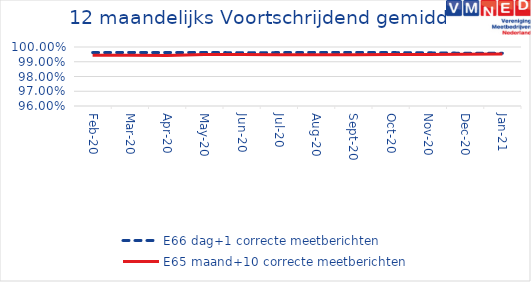
| Category | E66 dag+1 correcte meetberichten | E65 maand+10 correcte meetberichten |
|---|---|---|
| 2020-02-01 | 0.996 | 0.994 |
| 2020-03-01 | 0.996 | 0.994 |
| 2020-04-01 | 0.996 | 0.994 |
| 2020-05-01 | 0.996 | 0.995 |
| 2020-06-01 | 0.996 | 0.995 |
| 2020-07-01 | 0.996 | 0.995 |
| 2020-08-01 | 0.996 | 0.995 |
| 2020-09-01 | 0.996 | 0.995 |
| 2020-10-01 | 0.996 | 0.995 |
| 2020-11-01 | 0.996 | 0.995 |
| 2020-12-01 | 0.996 | 0.995 |
| 2021-01-01 | 0.996 | 0.995 |